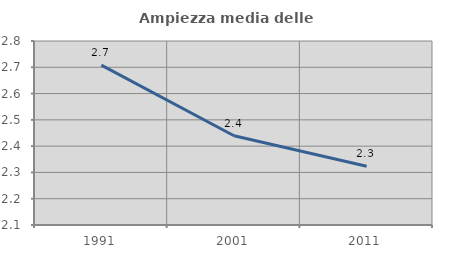
| Category | Ampiezza media delle famiglie |
|---|---|
| 1991.0 | 2.708 |
| 2001.0 | 2.44 |
| 2011.0 | 2.323 |